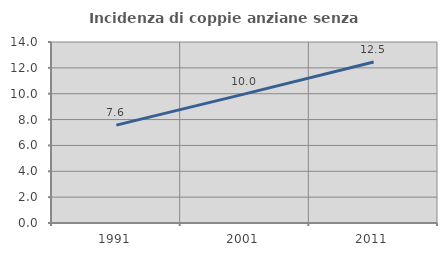
| Category | Incidenza di coppie anziane senza figli  |
|---|---|
| 1991.0 | 7.571 |
| 2001.0 | 9.991 |
| 2011.0 | 12.451 |